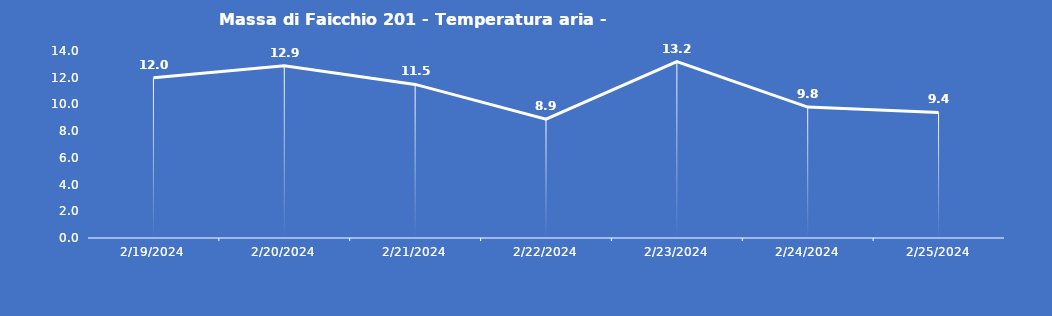
| Category | Massa di Faicchio 201 - Temperatura aria - Grezzo (°C) |
|---|---|
| 2/19/24 | 12 |
| 2/20/24 | 12.9 |
| 2/21/24 | 11.5 |
| 2/22/24 | 8.9 |
| 2/23/24 | 13.2 |
| 2/24/24 | 9.8 |
| 2/25/24 | 9.4 |